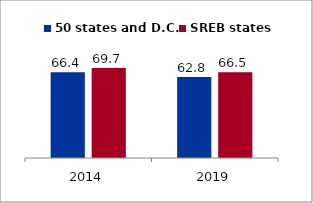
| Category | 50 states and D.C. | SREB states |
|---|---|---|
| 2014.0 | 66.433 | 69.745 |
| 2019.0 | 62.825 | 66.461 |